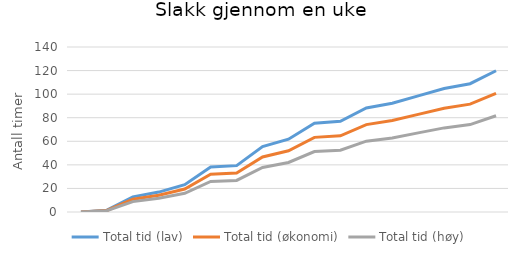
| Category | Total tid (lav) | Total tid (økonomi) | Total tid (høy) |
|---|---|---|---|
| 0 | 0 | 0 | 0 |
| 1 | 1.55 | 1.333 | 1.117 |
| 2 | 12.85 | 10.833 | 8.817 |
| 3 | 16.9 | 14.25 | 11.6 |
| 4 | 23.15 | 19.5 | 15.85 |
| 5 | 38.2 | 32.083 | 25.967 |
| 6 | 39.35 | 33.083 | 26.817 |
| 7 | 55.55 | 46.667 | 37.783 |
| 8 | 61.8 | 51.917 | 42.033 |
| 9 | 75.4 | 63.333 | 51.267 |
| 10 | 76.95 | 64.667 | 52.383 |
| 11 | 88.25 | 74.167 | 60.083 |
| 12 | 92.3 | 77.583 | 62.867 |
| 13 | 98.55 | 82.833 | 67.117 |
| 14 | 104.8 | 88.083 | 71.367 |
| 15 | 108.85 | 91.5 | 74.15 |
| 16 | 119.85 | 100.75 | 81.65 |